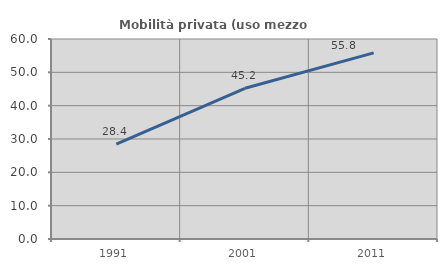
| Category | Mobilità privata (uso mezzo privato) |
|---|---|
| 1991.0 | 28.435 |
| 2001.0 | 45.221 |
| 2011.0 | 55.831 |